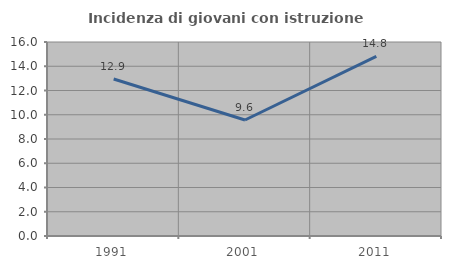
| Category | Incidenza di giovani con istruzione universitaria |
|---|---|
| 1991.0 | 12.95 |
| 2001.0 | 9.565 |
| 2011.0 | 14.815 |